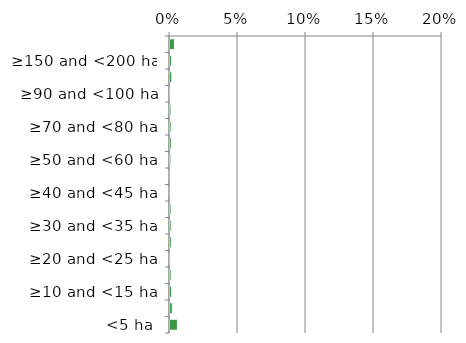
| Category | Near native & fragments |
|---|---|
| <5 ha | 0.005 |
| ≥5 and <10 ha | 0.002 |
| ≥10 and <15 ha | 0.001 |
| ≥15 and <20 ha | 0.001 |
| ≥20 and <25 ha | 0 |
| ≥25 and <30 ha | 0.001 |
| ≥30 and <35 ha | 0.001 |
| ≥35 and <40 ha | 0.001 |
| ≥40 and <45 ha | 0 |
| ≥45 and <50 ha | 0 |
| ≥50 and <60 ha | 0.001 |
| ≥60 and <70 ha | 0.001 |
| ≥70 and <80 ha | 0.001 |
| ≥80 and <90 ha | 0.001 |
| ≥90 and <100 ha | 0 |
| ≥100 and <150 ha | 0.001 |
| ≥150 and <200 ha | 0.001 |
| ≥200 ha | 0.003 |